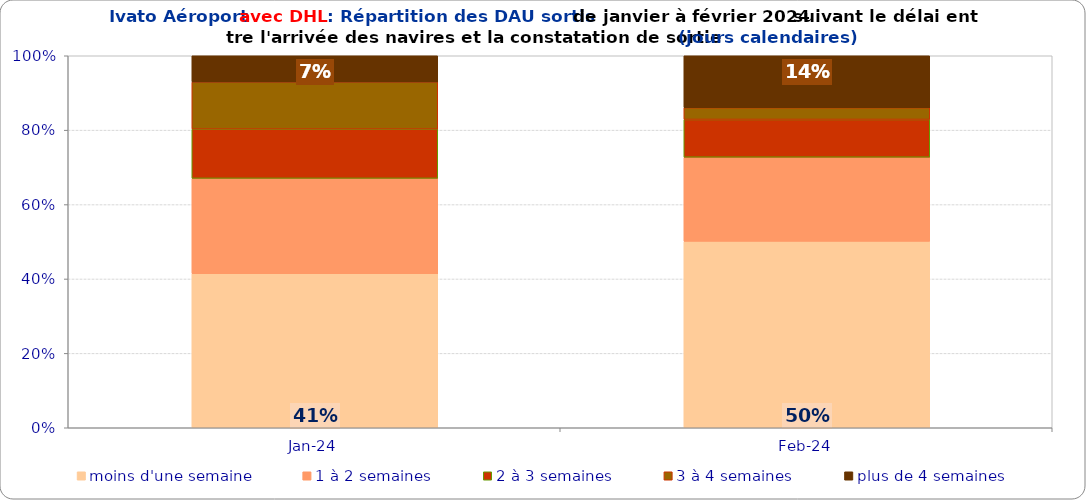
| Category | moins d'une semaine | 1 à 2 semaines | 2 à 3 semaines | 3 à 4 semaines | plus de 4 semaines |
|---|---|---|---|---|---|
| 2024-01-01 | 0.414 | 0.256 | 0.132 | 0.127 | 0.07 |
| 2024-02-01 | 0.501 | 0.226 | 0.101 | 0.032 | 0.14 |